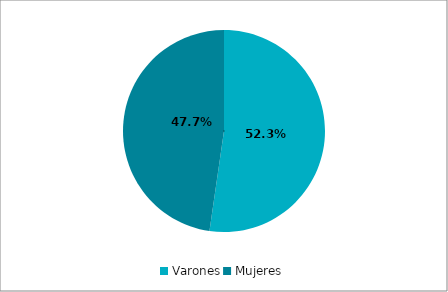
| Category | Absoluto | Relativo |
|---|---|---|
| Varones | 0.523 | 0.523 |
| Mujeres | 0.477 | 0.477 |